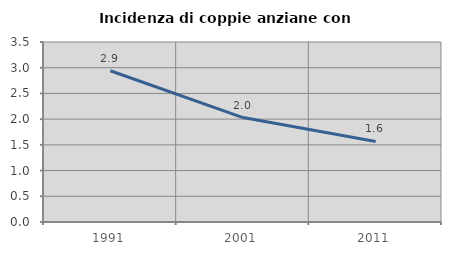
| Category | Incidenza di coppie anziane con figli |
|---|---|
| 1991.0 | 2.941 |
| 2001.0 | 2.03 |
| 2011.0 | 1.566 |